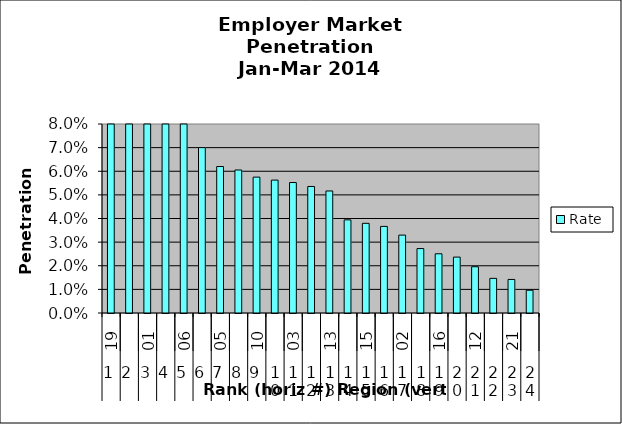
| Category | Rate |
|---|---|
| 0 | 0.125 |
| 1 | 0.102 |
| 2 | 0.099 |
| 3 | 0.094 |
| 4 | 0.082 |
| 5 | 0.07 |
| 6 | 0.062 |
| 7 | 0.061 |
| 8 | 0.058 |
| 9 | 0.056 |
| 10 | 0.055 |
| 11 | 0.054 |
| 12 | 0.052 |
| 13 | 0.039 |
| 14 | 0.038 |
| 15 | 0.037 |
| 16 | 0.033 |
| 17 | 0.027 |
| 18 | 0.025 |
| 19 | 0.024 |
| 20 | 0.02 |
| 21 | 0.015 |
| 22 | 0.014 |
| 23 | 0.01 |